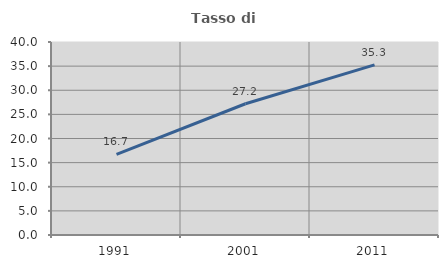
| Category | Tasso di occupazione   |
|---|---|
| 1991.0 | 16.696 |
| 2001.0 | 27.202 |
| 2011.0 | 35.255 |